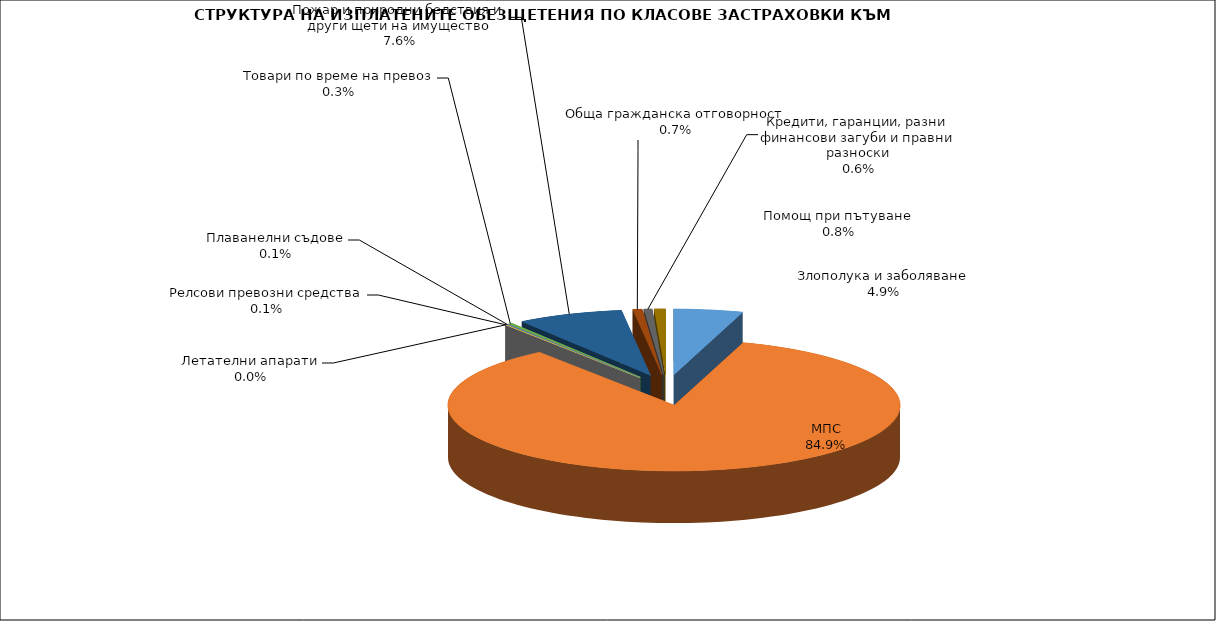
| Category | Series 0 |
|---|---|
| Злополука и заболяване | 0.049 |
| МПС | 0.849 |
| Релсови превозни средства | 0.001 |
| Летателни апарати | 0 |
| Плаванелни съдове | 0.001 |
| Товари по време на превоз | 0.003 |
| Пожар и природни бедствия и други щети на имущество | 0.076 |
| Обща гражданска отговорност | 0.007 |
| Кредити, гаранции, разни финансови загуби и правни разноски | 0.006 |
| Помощ при пътуване | 0.008 |